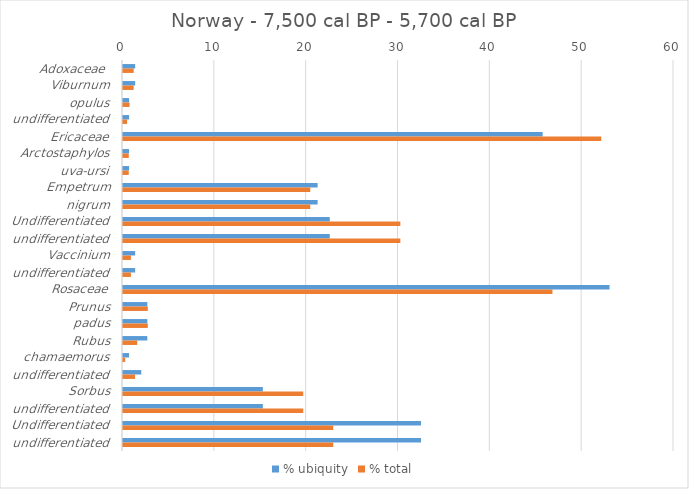
| Category | % ubiquity | % total |
|---|---|---|
| Adoxaceae  | 1.325 | 1.158 |
| Viburnum | 1.325 | 1.158 |
| opulus | 0.662 | 0.711 |
| undifferentiated | 0.662 | 0.447 |
| Ericaceae | 45.695 | 52.079 |
| Arctostaphylos | 0.662 | 0.625 |
| uva-ursi | 0.662 | 0.625 |
| Empetrum | 21.192 | 20.39 |
| nigrum | 21.192 | 20.39 |
| Undifferentiated | 22.517 | 30.201 |
| undifferentiated | 22.517 | 30.201 |
| Vaccinium | 1.325 | 0.863 |
| undifferentiated | 1.325 | 0.863 |
| Rosaceae | 52.98 | 46.762 |
| Prunus | 2.649 | 2.699 |
| padus | 2.649 | 2.699 |
| Rubus | 2.649 | 1.547 |
| chamaemorus | 0.662 | 0.236 |
| undifferentiated | 1.987 | 1.311 |
| Sorbus | 15.232 | 19.627 |
| undifferentiated | 15.232 | 19.627 |
| Undifferentiated | 32.45 | 22.889 |
| undifferentiated | 32.45 | 22.889 |